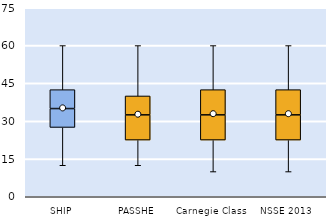
| Category | 25th | 50th | 75th |
|---|---|---|---|
| SHIP | 27.5 | 7.5 | 7.5 |
| PASSHE | 22.5 | 10 | 7.5 |
| Carnegie Class | 22.5 | 10 | 10 |
| NSSE 2013 | 22.5 | 10 | 10 |